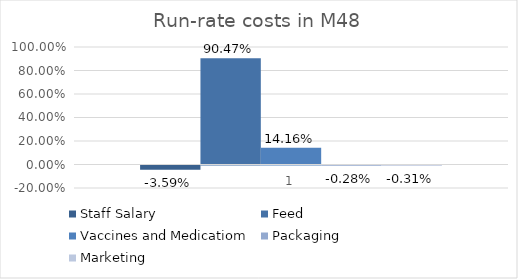
| Category | Staff Salary | Feed | Vaccines and Medicatiom | Packaging | Marketing |
|---|---|---|---|---|---|
| 0 | -0.036 | 0.905 | 0.142 | -0.003 | -0.003 |